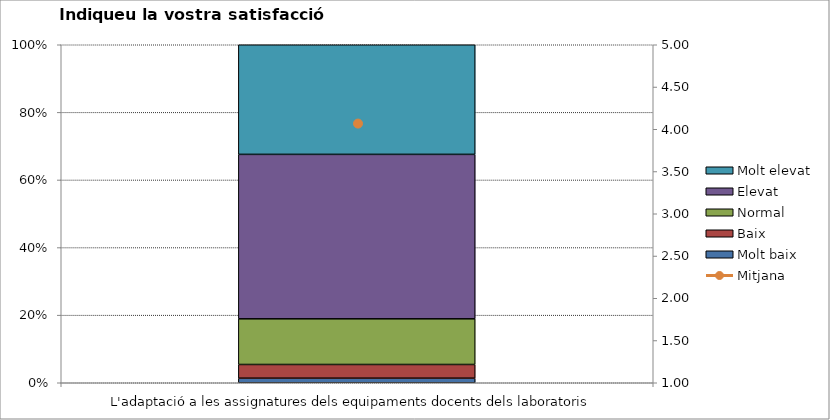
| Category | Molt baix | Baix | Normal  | Elevat | Molt elevat |
|---|---|---|---|---|---|
| L'adaptació a les assignatures dels equipaments docents dels laboratoris | 1 | 3 | 10 | 36 | 24 |